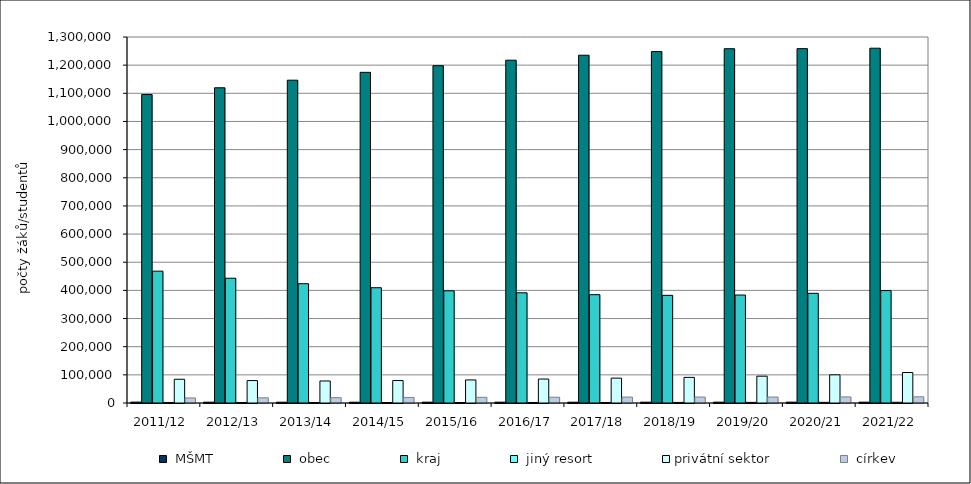
| Category |  MŠMT |  obec |  kraj |  jiný resort | privátní sektor |  církev |
|---|---|---|---|---|---|---|
| 2011/12 | 3182 | 1095653 | 468345 | 1853 | 84289 | 17953 |
| 2012/13 | 2931 | 1119660 | 443191 | 1792 | 79647 | 18458 |
| 2013/14 | 2815 | 1146572 | 423695 | 1782 | 78203 | 18969 |
| 2014/15 | 2763 | 1174507 | 409482 | 1690 | 79832 | 19724 |
| 2015/16 | 2903 | 1198133 | 398433 | 1762 | 81907 | 20100 |
| 2016/17 | 2889 | 1217638 | 391446 | 1848 | 85082 | 20584 |
| 2017/18 | 2813 | 1235311 | 384801 | 1941 | 88270 | 20927 |
| 2018/19 | 2911 | 1248266 | 382397 | 2045 | 90976 | 21152 |
| 2019/20 | 3021 | 1258412 | 383527 | 2197 | 95250 | 21076 |
| 2020/21 | 3001 | 1258684 | 389565 | 2329 | 100063 | 21570 |
| 2021/22 | 2987 | 1260189 | 399271 | 2507 | 108313 | 22024 |